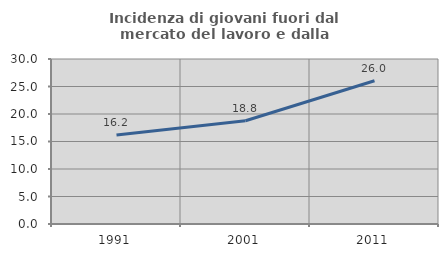
| Category | Incidenza di giovani fuori dal mercato del lavoro e dalla formazione  |
|---|---|
| 1991.0 | 16.201 |
| 2001.0 | 18.77 |
| 2011.0 | 26.038 |